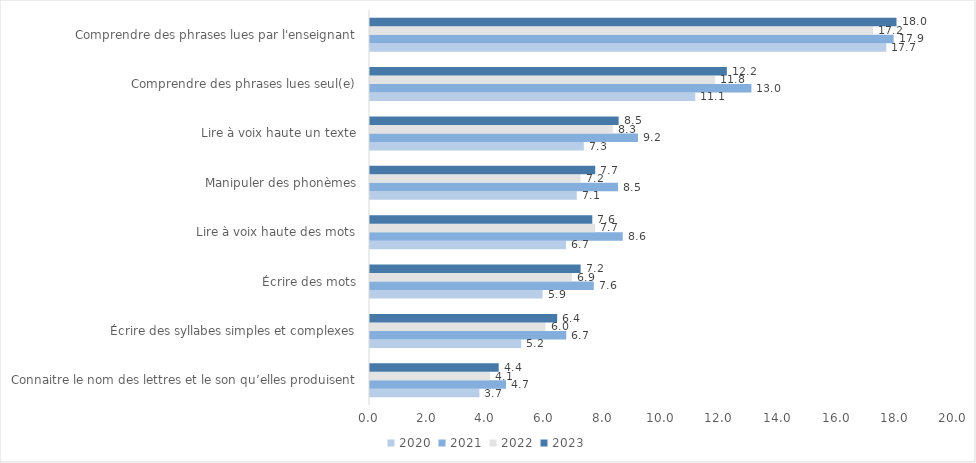
| Category | 2020 | 2021 | 2022 | 2023 |
|---|---|---|---|---|
| Connaitre le nom des lettres et le son qu’elles produisent | 3.74 | 4.65 | 4.1 | 4.4 |
| Écrire des syllabes simples et complexes | 5.17 | 6.71 | 6 | 6.4 |
| Écrire des mots | 5.9 | 7.65 | 6.9 | 7.2 |
| Lire à voix haute des mots | 6.7 | 8.64 | 7.7 | 7.6 |
| Manipuler des phonèmes | 7.07 | 8.48 | 7.2 | 7.7 |
| Lire à voix haute un texte | 7.31 | 9.16 | 8.3 | 8.5 |
| Comprendre des phrases lues seul(e) | 11.12 | 13.04 | 11.8 | 12.2 |
| Comprendre des phrases lues par l'enseignant | 17.65 | 17.9 | 17.2 | 18 |